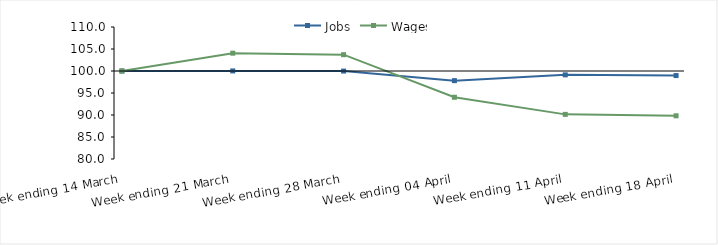
| Category | Jobs | Wages |
|---|---|---|
| 0 | 100 | 100 |
| 1900-01-01 | 100.017 | 104.05 |
| 1900-01-02 | 99.981 | 103.709 |
| 1900-01-03 | 97.804 | 94.035 |
| 1900-01-04 | 99.123 | 90.143 |
| 1900-01-05 | 98.962 | 89.818 |